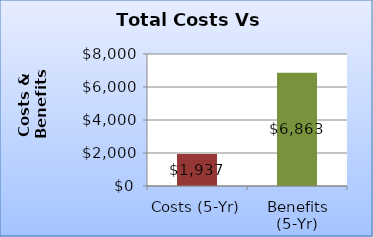
| Category | Series 0 |
|---|---|
| Costs (5-Yr) | 1936.576 |
| Benefits (5-Yr) | 6863.135 |